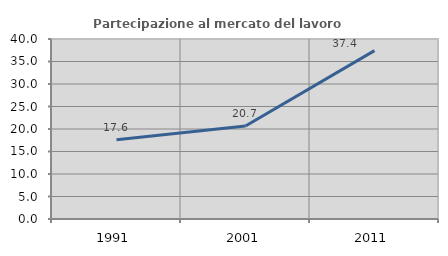
| Category | Partecipazione al mercato del lavoro  femminile |
|---|---|
| 1991.0 | 17.588 |
| 2001.0 | 20.67 |
| 2011.0 | 37.415 |